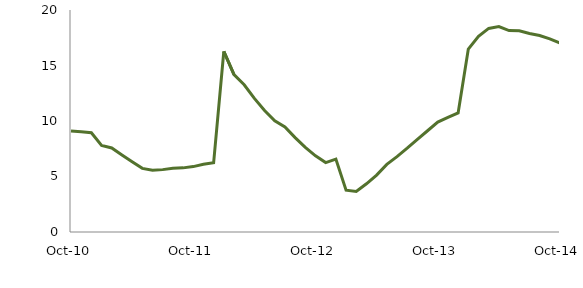
| Category | Series 0 |
|---|---|
| Oct-10 | 9.109 |
|  | 9.032 |
|  | 8.944 |
|  | 7.796 |
|  | 7.572 |
|  | 6.945 |
|  | 6.327 |
|  | 5.732 |
|  | 5.566 |
|  | 5.619 |
|  | 5.739 |
|  | 5.777 |
| Oct-11 | 5.893 |
|  | 6.097 |
|  | 6.236 |
|  | 16.275 |
|  | 14.177 |
|  | 13.262 |
|  | 12.037 |
|  | 10.94 |
|  | 10.022 |
|  | 9.459 |
|  | 8.507 |
|  | 7.627 |
| Oct-12 | 6.858 |
|  | 6.256 |
|  | 6.564 |
|  | 3.761 |
|  | 3.651 |
|  | 4.343 |
|  | 5.123 |
|  | 6.09 |
|  | 6.793 |
|  | 7.549 |
|  | 8.351 |
|  | 9.122 |
| Oct-13 | 9.9 |
|  | 10.325 |
|  | 10.727 |
|  | 16.476 |
|  | 17.627 |
|  | 18.342 |
|  | 18.502 |
|  | 18.146 |
|  | 18.121 |
|  | 17.884 |
|  | 17.705 |
|  | 17.398 |
| Oct-14 | 17.024 |